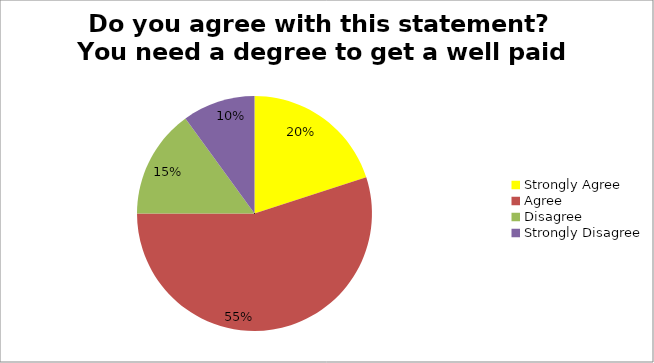
| Category | Series 0 |
|---|---|
| Strongly Agree | 4 |
| Agree | 11 |
| Disagree | 3 |
| Strongly Disagree | 2 |